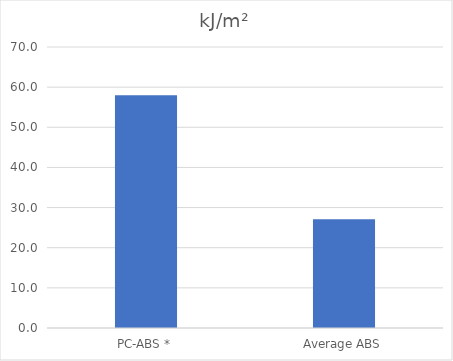
| Category | kJ/m² |
|---|---|
| PC-ABS * | 57.959 |
| Average ABS | 27.1 |